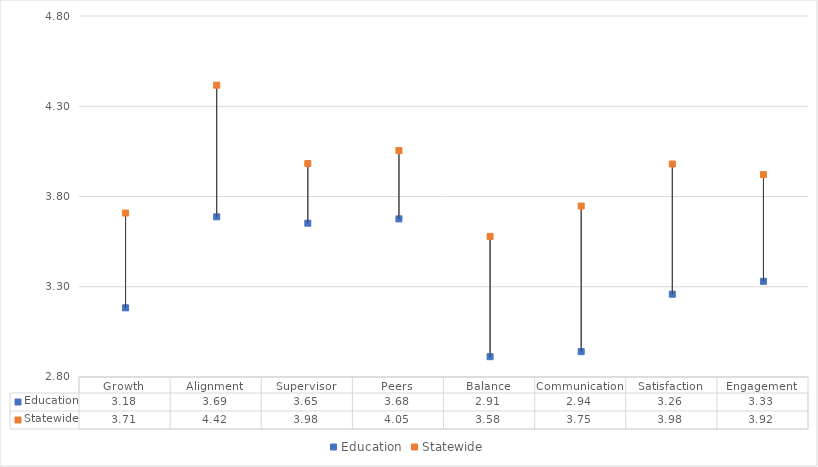
| Category | Education | Statewide |
|---|---|---|
| Growth | 3.183 | 3.708 |
| Alignment | 3.688 | 4.417 |
| Supervisor | 3.652 | 3.983 |
| Peers | 3.676 | 4.054 |
| Balance | 2.912 | 3.579 |
| Communication | 2.941 | 3.747 |
| Satisfaction | 3.259 | 3.98 |
| Engagement | 3.33 | 3.921 |